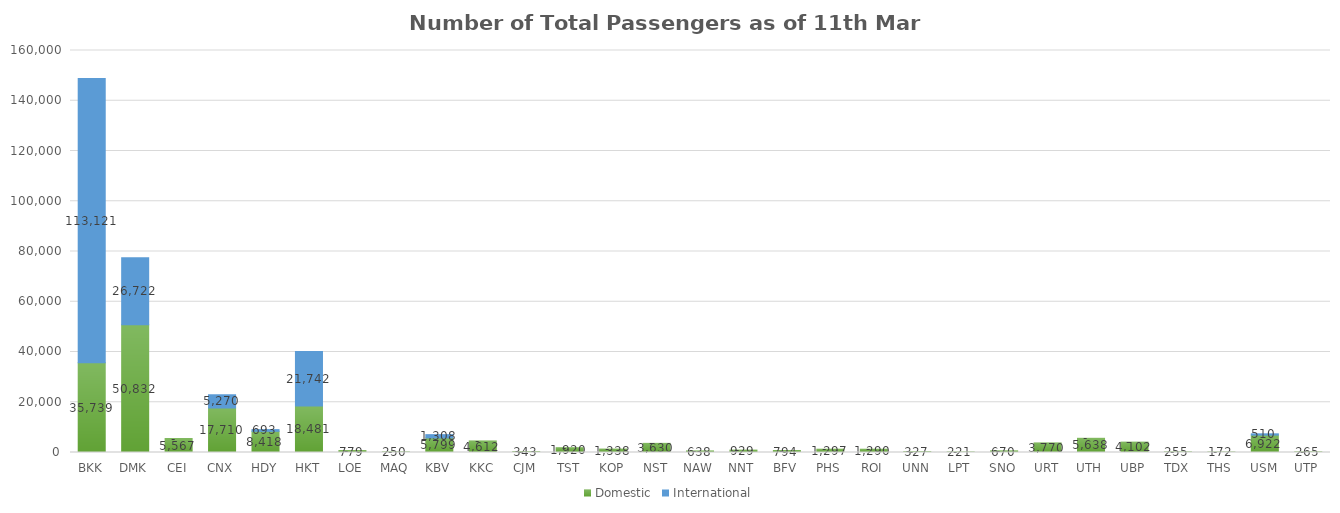
| Category | Domestic | International |
|---|---|---|
| BKK | 35739 | 113121 |
| DMK | 50832 | 26722 |
| CEI | 5567 | 0 |
| CNX | 17710 | 5270 |
| HDY | 8418 | 693 |
| HKT | 18481 | 21742 |
| LOE | 779 | 0 |
| MAQ | 250 | 0 |
| KBV | 5799 | 1308 |
| KKC | 4612 | 0 |
| CJM | 343 | 0 |
| TST | 1920 | 0 |
| KOP | 1338 | 0 |
| NST | 3630 | 0 |
| NAW | 638 | 0 |
| NNT | 929 | 0 |
| BFV | 794 | 0 |
| PHS | 1297 | 0 |
| ROI | 1290 | 0 |
| UNN | 327 | 0 |
| LPT | 221 | 0 |
| SNO | 670 | 0 |
| URT | 3770 | 0 |
| UTH | 5638 | 0 |
| UBP | 4102 | 0 |
| TDX | 255 | 0 |
| THS | 172 | 0 |
| USM | 6922 | 510 |
| UTP | 265 | 0 |